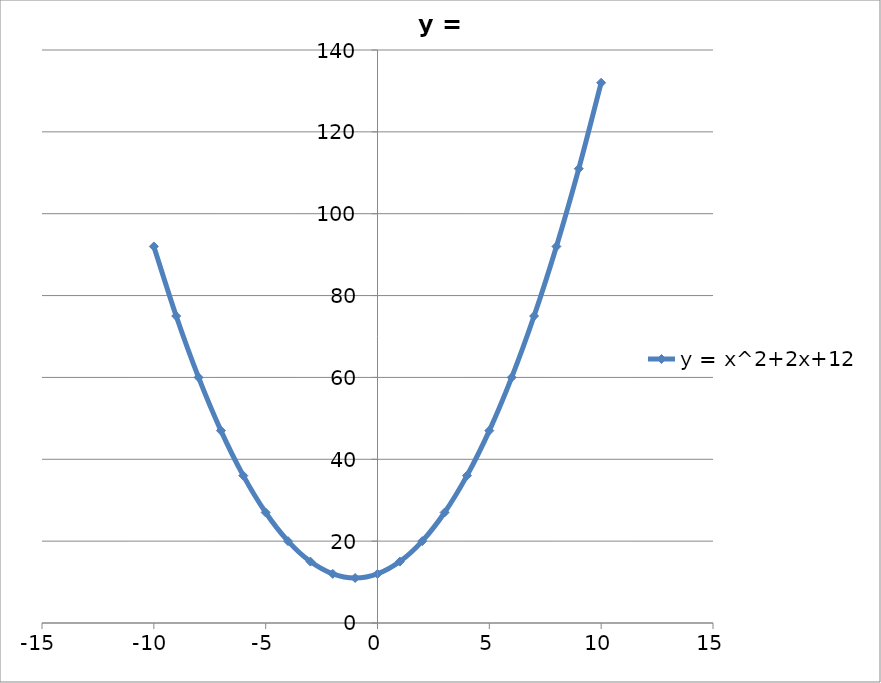
| Category | y = x^2+2x+12 |
|---|---|
| -10.0 | 92 |
| -9.0 | 75 |
| -8.0 | 60 |
| -7.0 | 47 |
| -6.0 | 36 |
| -5.0 | 27 |
| -4.0 | 20 |
| -3.0 | 15 |
| -2.0 | 12 |
| -1.0 | 11 |
| 0.0 | 12 |
| 1.0 | 15 |
| 2.0 | 20 |
| 3.0 | 27 |
| 4.0 | 36 |
| 5.0 | 47 |
| 6.0 | 60 |
| 7.0 | 75 |
| 8.0 | 92 |
| 9.0 | 111 |
| 10.0 | 132 |